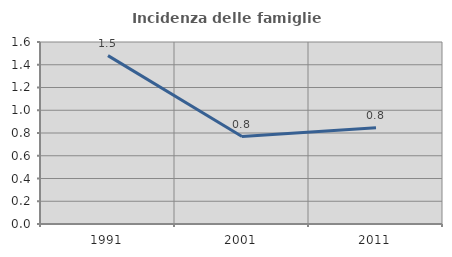
| Category | Incidenza delle famiglie numerose |
|---|---|
| 1991.0 | 1.48 |
| 2001.0 | 0.769 |
| 2011.0 | 0.847 |